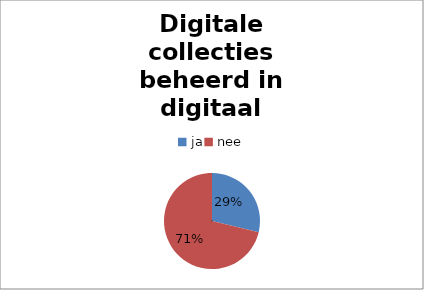
| Category | Series 0 |
|---|---|
| ja | 27 |
| nee | 67 |